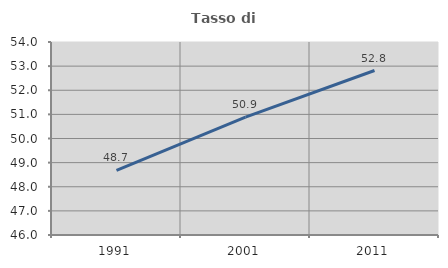
| Category | Tasso di occupazione   |
|---|---|
| 1991.0 | 48.674 |
| 2001.0 | 50.887 |
| 2011.0 | 52.818 |